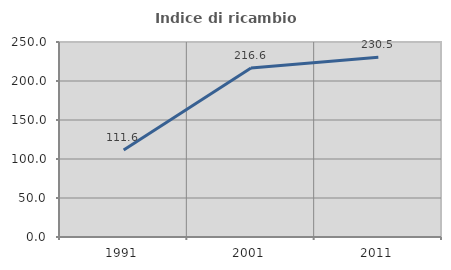
| Category | Indice di ricambio occupazionale  |
|---|---|
| 1991.0 | 111.576 |
| 2001.0 | 216.58 |
| 2011.0 | 230.488 |